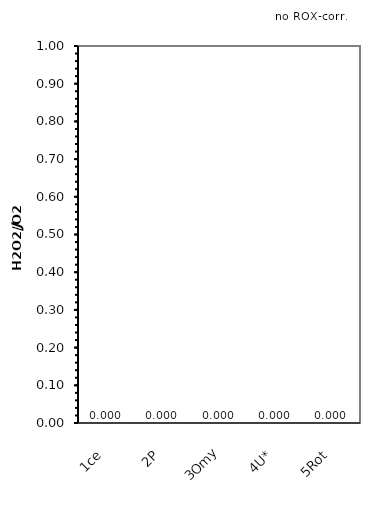
| Category | no ROX-corr. |
|---|---|
| 1ce | 0 |
| 2P | 0 |
| 3Omy | 0 |
| 4U* | 0 |
| 5Rot | 0 |